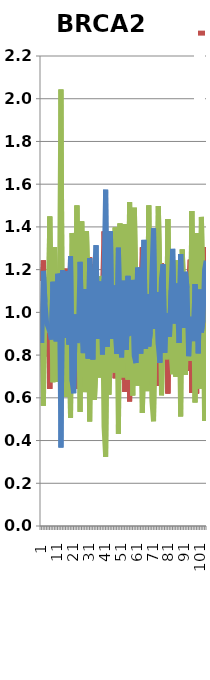
| Category | BR1379 | BR1381 | BR1382 |
|---|---|---|---|
| 0 | 1.146 | 0.997 | 0.857 |
| 1 | 1.243 | 0.563 | 1.194 |
| 2 | 0.794 | 1.161 | 1.044 |
| 3 | 1.051 | 0.999 | 0.95 |
| 4 | 1.162 | 0.907 | 0.931 |
| 5 | 0.642 | 1.448 | 0.91 |
| 6 | 1.052 | 1.075 | 0.873 |
| 7 | 1.184 | 0.673 | 1.143 |
| 8 | 0.705 | 1.306 | 0.989 |
| 9 | 1.051 | 1.085 | 0.864 |
| 10 | 1.145 | 0.675 | 1.181 |
| 11 | 0.879 | 0.974 | 1.147 |
| 12 | 0.589 | 2.044 | 0.367 |
| 13 | 1.168 | 0.634 | 1.197 |
| 14 | 1.06 | 1.06 | 0.88 |
| 15 | 1.204 | 0.605 | 1.191 |
| 16 | 0.833 | 1.09 | 1.077 |
| 17 | 1.033 | 1.118 | 0.849 |
| 18 | 1.231 | 0.506 | 1.263 |
| 19 | 0.952 | 1.372 | 0.676 |
| 20 | 1.13 | 1.249 | 0.621 |
| 21 | 1.125 | 0.885 | 0.99 |
| 22 | 0.642 | 1.501 | 0.857 |
| 23 | 1.031 | 1.058 | 0.911 |
| 24 | 1.229 | 0.534 | 1.236 |
| 25 | 0.652 | 1.426 | 0.922 |
| 26 | 1.077 | 1.114 | 0.809 |
| 27 | 1.264 | 0.627 | 1.109 |
| 28 | 0.678 | 1.38 | 0.942 |
| 29 | 1.1 | 1.116 | 0.783 |
| 30 | 1.258 | 0.489 | 1.253 |
| 31 | 0.948 | 1.018 | 1.034 |
| 32 | 1.067 | 1.154 | 0.779 |
| 33 | 1.225 | 0.591 | 1.184 |
| 34 | 0.928 | 0.758 | 1.314 |
| 35 | 1.039 | 1.086 | 0.876 |
| 36 | 1.161 | 0.695 | 1.144 |
| 37 | 0.758 | 1.171 | 1.072 |
| 38 | 1.084 | 1.114 | 0.803 |
| 39 | 1.379 | 0.465 | 1.156 |
| 40 | 1.102 | 0.324 | 1.574 |
| 41 | 1.116 | 1.045 | 0.84 |
| 42 | 1.217 | 0.615 | 1.168 |
| 43 | 0.818 | 0.802 | 1.38 |
| 44 | 1.034 | 1.089 | 0.876 |
| 45 | 1.156 | 0.719 | 1.126 |
| 46 | 0.692 | 1.398 | 0.911 |
| 47 | 1.075 | 1.119 | 0.806 |
| 48 | 1.266 | 0.431 | 1.303 |
| 49 | 0.686 | 1.416 | 0.898 |
| 50 | 1.205 | 1.006 | 0.789 |
| 51 | 1.156 | 0.696 | 1.148 |
| 52 | 0.627 | 1.412 | 0.96 |
| 53 | 1.145 | 1.03 | 0.825 |
| 54 | 1.144 | 0.685 | 1.171 |
| 55 | 0.583 | 1.516 | 0.901 |
| 56 | 1.05 | 1.046 | 0.903 |
| 57 | 1.237 | 0.61 | 1.152 |
| 58 | 0.717 | 1.489 | 0.794 |
| 59 | 1.162 | 1.075 | 0.763 |
| 60 | 1.134 | 0.657 | 1.209 |
| 61 | 0.931 | 0.884 | 1.184 |
| 62 | 1.082 | 1.111 | 0.807 |
| 63 | 1.305 | 0.529 | 1.166 |
| 64 | 0.813 | 0.847 | 1.339 |
| 65 | 1.132 | 1.039 | 0.828 |
| 66 | 1.283 | 0.631 | 1.085 |
| 67 | 0.659 | 1.501 | 0.841 |
| 68 | 1.074 | 1.018 | 0.908 |
| 69 | 1.234 | 0.585 | 1.181 |
| 70 | 1.116 | 0.49 | 1.393 |
| 71 | 1.1 | 0.977 | 0.923 |
| 72 | 1.14 | 0.765 | 1.095 |
| 73 | 0.655 | 1.497 | 0.848 |
| 74 | 1.082 | 1.154 | 0.764 |
| 75 | 1.229 | 0.612 | 1.159 |
| 76 | 0.873 | 0.902 | 1.225 |
| 77 | 1.139 | 1.051 | 0.81 |
| 78 | 1.224 | 0.781 | 0.995 |
| 79 | 0.62 | 1.437 | 0.942 |
| 80 | 1.057 | 1.058 | 0.886 |
| 81 | 1.082 | 0.814 | 1.104 |
| 82 | 0.992 | 0.711 | 1.297 |
| 83 | 0.989 | 1.063 | 0.948 |
| 84 | 1.167 | 0.699 | 1.135 |
| 85 | 0.724 | 1.243 | 1.034 |
| 86 | 1.09 | 1.053 | 0.857 |
| 87 | 1.214 | 0.513 | 1.273 |
| 88 | 0.73 | 1.294 | 0.976 |
| 89 | 0.997 | 1.075 | 0.928 |
| 90 | 1.103 | 0.707 | 1.19 |
| 91 | 0.726 | 1.16 | 1.114 |
| 92 | 1.141 | 1.064 | 0.795 |
| 93 | 1.247 | 0.774 | 0.979 |
| 94 | 0.623 | 1.474 | 0.903 |
| 95 | 1.064 | 1.071 | 0.865 |
| 96 | 1.29 | 0.578 | 1.132 |
| 97 | 0.621 | 1.372 | 1.008 |
| 98 | 1.134 | 1.058 | 0.808 |
| 99 | 1.25 | 0.643 | 1.107 |
| 100 | 0.647 | 1.447 | 0.906 |
| 101 | 0.986 | 1.05 | 0.964 |
| 102 | 1.306 | 0.493 | 1.201 |
| 103 | 0.845 | 0.914 | 1.242 |